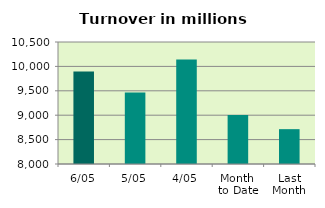
| Category | Series 0 |
|---|---|
| 6/05 | 9896.436 |
| 5/05 | 9464.456 |
| 4/05 | 10139.685 |
| Month 
to Date | 9002.551 |
| Last
Month | 8713.977 |